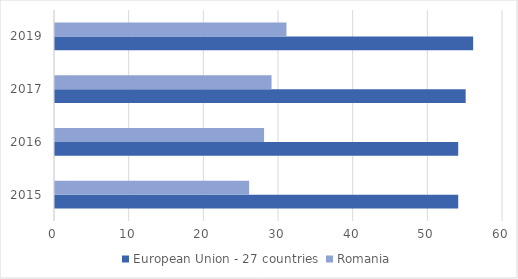
| Category | European Union - 27 countries | Romania |
|---|---|---|
| 2015 | 54 | 26 |
| 2016 | 54 | 28 |
| 2017 | 55 | 29 |
| 2019 | 56 | 31 |